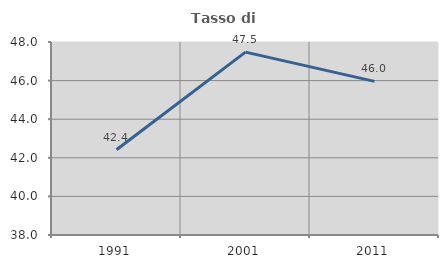
| Category | Tasso di occupazione   |
|---|---|
| 1991.0 | 42.419 |
| 2001.0 | 47.475 |
| 2011.0 | 45.96 |